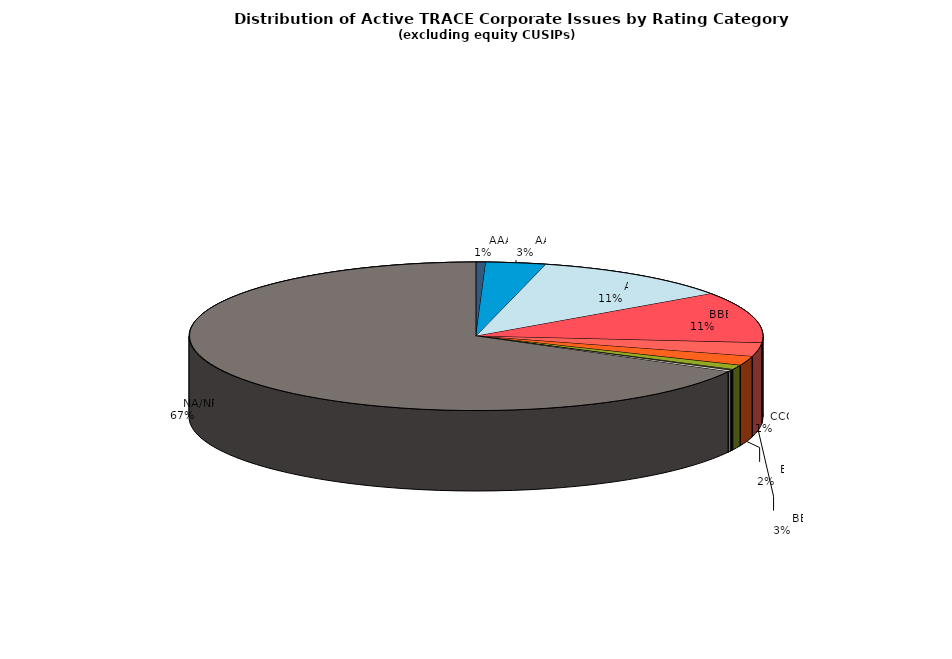
| Category | Series 0 |
|---|---|
|         AAA | 436 |
|         AA | 2671 |
|         A | 9002 |
|         BBB | 8797 |
|         BB | 2357 |
|         B | 1587 |
|         CCC | 778 |
|         CC | 98 |
|         C | 85 |
|         D | 252 |
|         NA/NR | 53066 |